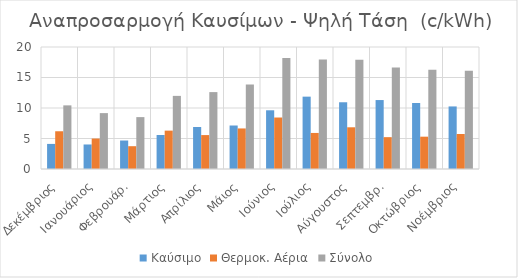
| Category | Καύσιμο | Θερμοκ. Αέρια | Σύνολο |
|---|---|---|---|
| Δεκέμβριος | 4.113 | 6.188 | 10.431 |
| Ιανουάριος | 4.02 | 4.996 | 9.163 |
| Φεβρουάρ. | 4.67 | 3.738 | 8.506 |
| Μάρτιος | 5.571 | 6.291 | 11.986 |
| Απρίλιος | 6.89 | 5.562 | 12.606 |
| Μάιος | 7.13 | 6.649 | 13.852 |
| Ιούνιος | 9.626 | 8.44 | 18.192 |
| Ιούλιος | 11.861 | 5.91 | 17.936 |
| Αύγουστος | 10.941 | 6.838 | 17.904 |
| Σεπτεμβρ. | 11.303 | 5.221 | 16.658 |
| Οκτώβριος | 10.824 | 5.298 | 16.264 |
| Νοέμβριος | 10.257 | 5.733 | 16.114 |